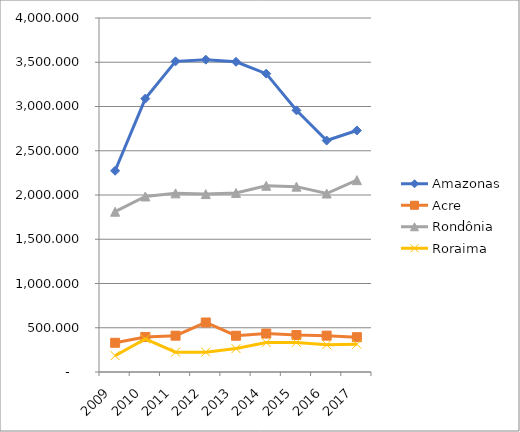
| Category | Amazonas | Acre | Rondônia | Roraima |
|---|---|---|---|---|
| 2009.0 | 2273.731 | 330.294 | 1811.217 | 184.254 |
| 2010.0 | 3089.284 | 396.231 | 1983.51 | 373.506 |
| 2011.0 | 3510.155 | 410.372 | 2018.512 | 224.324 |
| 2012.0 | 3529.474 | 559.398 | 2010.372 | 224.414 |
| 2013.0 | 3505.348 | 409.676 | 2023.189 | 264.458 |
| 2014.0 | 3371.199 | 434.737 | 2104.67 | 332.131 |
| 2015.0 | 2956.805 | 417.738 | 2094.35 | 334.576 |
| 2016.0 | 2615.349 | 410.948 | 2016.695 | 308.142 |
| 2017.0 | 2729.316 | 393.44 | 2168.009 | 314 |